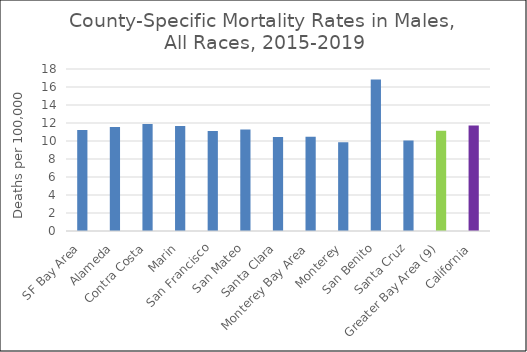
| Category | Male |
|---|---|
| SF Bay Area | 11.23 |
|   Alameda | 11.56 |
|   Contra Costa | 11.88 |
|   Marin | 11.67 |
|   San Francisco | 11.1 |
|   San Mateo | 11.28 |
|   Santa Clara | 10.45 |
| Monterey Bay Area | 10.46 |
|   Monterey | 9.85 |
|   San Benito | 16.83 |
|   Santa Cruz | 10.05 |
| Greater Bay Area (9) | 11.15 |
| California | 11.73 |